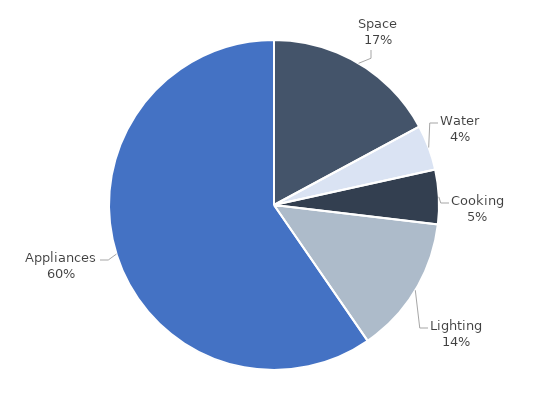
| Category | Series 0 |
|---|---|
| Space | 1529.086 |
| Water | 394.748 |
| Cooking | 475.746 |
| Lighting | 1206.496 |
| Appliances | 5321.256 |